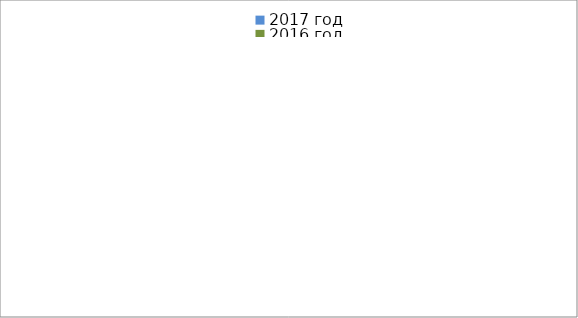
| Category | 2017 год | 2016 год |
|---|---|---|
|  - поджог | 17 | 40 |
|  - неосторожное обращение с огнём | 7 | 22 |
|  - НПТЭ электрооборудования | 25 | 20 |
|  - НПУ и Э печей | 46 | 32 |
|  - НПУ и Э транспортных средств | 44 | 32 |
|   -Шалость с огнем детей | 4 | 6 |
|  -НППБ при эксплуатации эл.приборов | 24 | 14 |
|  - курение | 35 | 26 |
| - прочие | 72 | 93 |
| - не установленные причины | 0 | 12 |